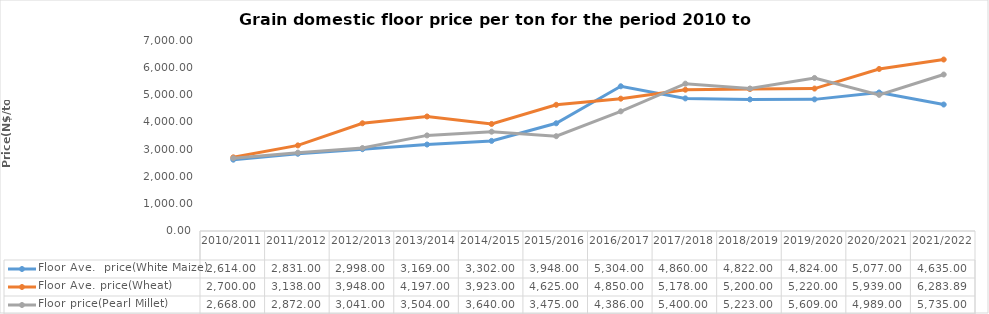
| Category | Floor Ave.  price(White Maize) | Floor Ave. price(Wheat) | Floor price(Pearl Millet) |
|---|---|---|---|
| 2010/2011 | 2614 | 2700 | 2668 |
| 2011/2012 | 2831 | 3138 | 2872 |
| 2012/2013 | 2998 | 3948 | 3041 |
| 2013/2014 | 3169 | 4197 | 3504 |
| 2014/2015 | 3302 | 3923 | 3640 |
| 2015/2016 | 3948 | 4625 | 3475 |
| 2016/2017 | 5304 | 4850 | 4386 |
| 2017/2018 | 4860 | 5178 | 5400 |
| 2018/2019 | 4822 | 5200 | 5223 |
| 2019/2020 | 4824 | 5220 | 5609 |
| 2020/2021 | 5077 | 5939 | 4989 |
| 2021/2022 | 4635 | 6283.89 | 5735 |